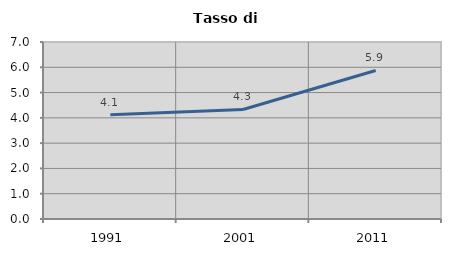
| Category | Tasso di disoccupazione   |
|---|---|
| 1991.0 | 4.122 |
| 2001.0 | 4.333 |
| 2011.0 | 5.875 |